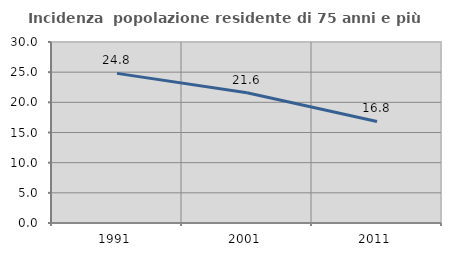
| Category | Incidenza  popolazione residente di 75 anni e più |
|---|---|
| 1991.0 | 24.798 |
| 2001.0 | 21.574 |
| 2011.0 | 16.825 |